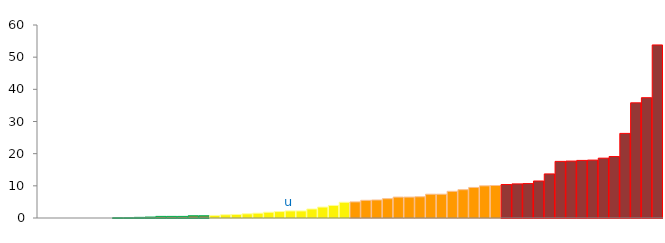
| Category | Top Quartile | 2nd Quartile | 3rd Quartile | Bottom Quartile | Series 4 |
|---|---|---|---|---|---|
|  | 0 | 0 | 0 | 0 | 0 |
|  | 0 | 0 | 0 | 0 | 0 |
|  | 0 | 0 | 0 | 0 | 0 |
|  | 0 | 0 | 0 | 0 | 0 |
|  | 0 | 0 | 0 | 0 | 0 |
|  | 0 | 0 | 0 | 0 | 0 |
|  | 0 | 0 | 0 | 0 | 0 |
|  | 0.1 | 0 | 0 | 0 | 0.1 |
|  | 0.1 | 0 | 0 | 0 | 0.1 |
|  | 0.2 | 0 | 0 | 0 | 0.2 |
|  | 0.3 | 0 | 0 | 0 | 0.3 |
|  | 0.5 | 0 | 0 | 0 | 0.5 |
|  | 0.5 | 0 | 0 | 0 | 0.5 |
|  | 0.5 | 0 | 0 | 0 | 0.5 |
|  | 0.7 | 0 | 0 | 0 | 0.7 |
|  | 0.7 | 0 | 0 | 0 | 0.7 |
|  | 0 | 0.8 | 0 | 0 | 0.8 |
|  | 0 | 1 | 0 | 0 | 1 |
|  | 0 | 1.1 | 0 | 0 | 1.1 |
|  | 0 | 1.3 | 0 | 0 | 1.3 |
|  | 0 | 1.5 | 0 | 0 | 1.5 |
|  | 0 | 1.8 | 0 | 0 | 1.8 |
|  | 0 | 2 | 0 | 0 | 2 |
| u | 0 | 2.2 | 0 | 0 | 2.2 |